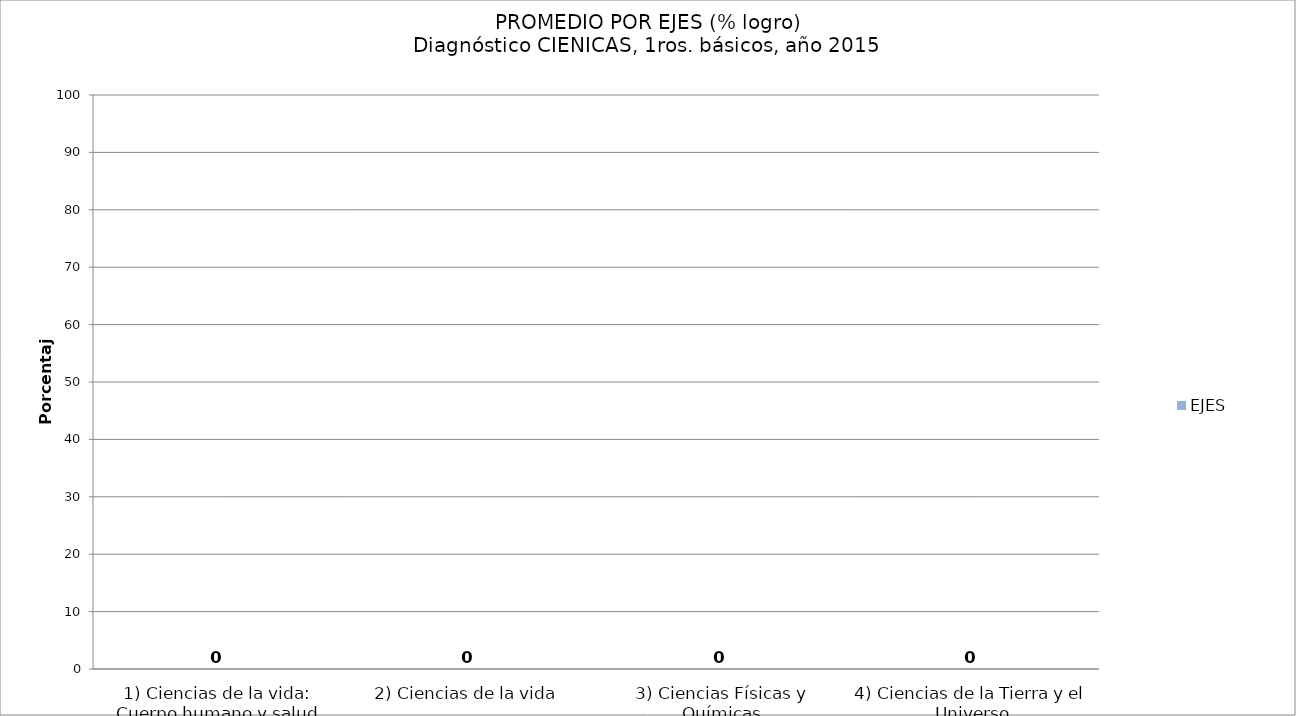
| Category | EJES |
|---|---|
| 1) Ciencias de la vida: Cuerpo humano y salud | 0 |
| 2) Ciencias de la vida | 0 |
| 3) Ciencias Físicas y Químicas | 0 |
| 4) Ciencias de la Tierra y el Universo | 0 |